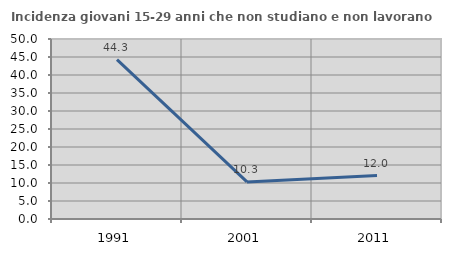
| Category | Incidenza giovani 15-29 anni che non studiano e non lavorano  |
|---|---|
| 1991.0 | 44.275 |
| 2001.0 | 10.306 |
| 2011.0 | 12.049 |